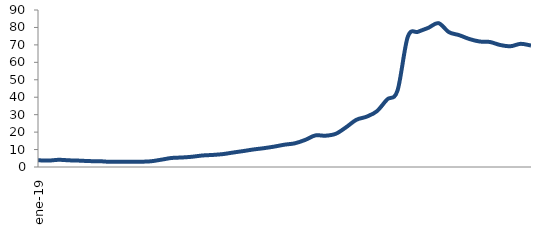
| Category | Series 0 |
|---|---|
| 2019-01-01 | 3.873 |
| 2019-02-01 | 3.657 |
| 2019-03-01 | 4.125 |
| 2019-04-01 | 3.826 |
| 2019-05-01 | 3.652 |
| 2019-06-01 | 3.379 |
| 2019-07-01 | 3.329 |
| 2019-08-01 | 2.95 |
| 2019-09-01 | 3.068 |
| 2019-10-01 | 3.068 |
| 2019-11-01 | 3.019 |
| 2019-12-01 | 3.273 |
| 2020-01-01 | 4.186 |
| 2020-02-01 | 5.17 |
| 2020-03-01 | 5.444 |
| 2020-04-01 | 5.874 |
| 2020-05-01 | 6.591 |
| 2020-06-01 | 6.913 |
| 2020-07-01 | 7.395 |
| 2020-08-01 | 8.292 |
| 2020-09-01 | 9.145 |
| 2020-10-01 | 10.067 |
| 2020-11-01 | 10.794 |
| 2020-12-01 | 11.695 |
| 2021-01-01 | 12.796 |
| 2021-02-01 | 13.569 |
| 2021-03-01 | 15.494 |
| 2021-04-01 | 18.102 |
| 2021-05-01 | 17.933 |
| 2021-06-01 | 19.058 |
| 2021-07-01 | 22.799 |
| 2021-08-01 | 27.071 |
| 2021-09-01 | 28.872 |
| 2021-10-01 | 32.01 |
| 2021-11-01 | 38.771 |
| 2021-12-01 | 43.773 |
| 2022-01-01 | 74.56 |
| 2022-02-01 | 77.497 |
| 2022-03-01 | 79.776 |
| 2022-04-01 | 82.45 |
| 2022-05-01 | 77.33 |
| 2022-06-01 | 75.589 |
| 2022-07-01 | 73.365 |
| 2022-08-01 | 71.938 |
| 2022-09-01 | 71.66 |
| 2022-10-01 | 69.929 |
| 2022-11-01 | 69.213 |
| 2022-12-01 | 70.607 |
| 2023-01-01 | 69.621 |